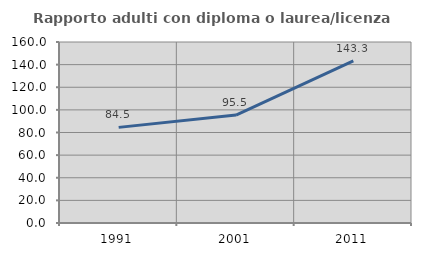
| Category | Rapporto adulti con diploma o laurea/licenza media  |
|---|---|
| 1991.0 | 84.536 |
| 2001.0 | 95.455 |
| 2011.0 | 143.333 |